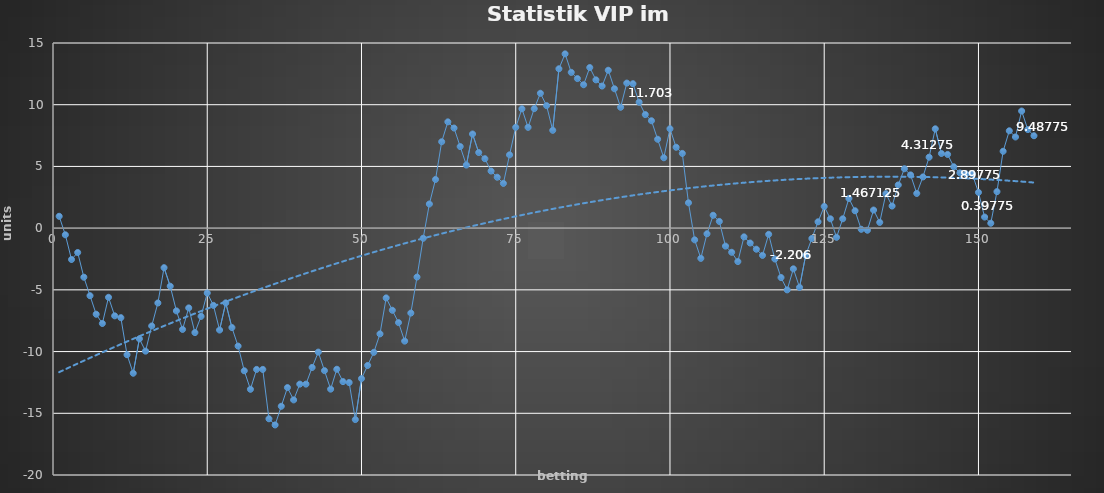
| Category | Series 0 |
|---|---|
| 0 | 0.96 |
| 1 | -0.54 |
| 2 | -2.54 |
| 3 | -1.974 |
| 4 | -3.974 |
| 5 | -5.474 |
| 6 | -6.974 |
| 7 | -7.724 |
| 8 | -5.604 |
| 9 | -7.104 |
| 10 | -7.254 |
| 11 | -10.254 |
| 12 | -11.754 |
| 13 | -8.965 |
| 14 | -9.965 |
| 15 | -7.925 |
| 16 | -6.065 |
| 17 | -3.204 |
| 18 | -4.704 |
| 19 | -6.704 |
| 20 | -8.204 |
| 21 | -6.461 |
| 22 | -8.461 |
| 23 | -7.147 |
| 24 | -5.255 |
| 25 | -6.255 |
| 26 | -8.255 |
| 27 | -6.055 |
| 28 | -8.055 |
| 29 | -9.555 |
| 30 | -11.555 |
| 31 | -13.055 |
| 32 | -11.445 |
| 33 | -11.445 |
| 34 | -15.445 |
| 35 | -15.945 |
| 36 | -14.43 |
| 37 | -12.915 |
| 38 | -13.915 |
| 39 | -12.636 |
| 40 | -12.636 |
| 41 | -11.286 |
| 42 | -10.043 |
| 43 | -11.543 |
| 44 | -13.043 |
| 45 | -11.433 |
| 46 | -12.433 |
| 47 | -12.508 |
| 48 | -15.508 |
| 49 | -12.188 |
| 50 | -11.123 |
| 51 | -10.058 |
| 52 | -8.566 |
| 53 | -5.652 |
| 54 | -6.652 |
| 55 | -7.652 |
| 56 | -9.152 |
| 57 | -6.879 |
| 58 | -3.962 |
| 59 | -0.82 |
| 60 | 1.955 |
| 61 | 3.945 |
| 62 | 6.999 |
| 63 | 8.612 |
| 64 | 8.112 |
| 65 | 6.612 |
| 66 | 5.112 |
| 67 | 7.627 |
| 68 | 6.127 |
| 69 | 5.627 |
| 70 | 4.627 |
| 71 | 4.127 |
| 72 | 3.627 |
| 73 | 5.939 |
| 74 | 8.169 |
| 75 | 9.669 |
| 76 | 8.169 |
| 77 | 9.684 |
| 78 | 10.927 |
| 79 | 9.927 |
| 80 | 7.927 |
| 81 | 12.912 |
| 82 | 14.119 |
| 83 | 12.619 |
| 84 | 12.119 |
| 85 | 11.619 |
| 86 | 13.014 |
| 87 | 12.014 |
| 88 | 11.514 |
| 89 | 12.793 |
| 90 | 11.293 |
| 91 | 9.793 |
| 92 | 11.753 |
| 93 | 11.703 |
| 94 | 10.203 |
| 95 | 9.203 |
| 96 | 8.703 |
| 97 | 7.203 |
| 98 | 5.703 |
| 99 | 8.054 |
| 100 | 6.554 |
| 101 | 6.054 |
| 102 | 2.054 |
| 103 | -0.946 |
| 104 | -2.446 |
| 105 | -0.456 |
| 106 | 1.044 |
| 107 | 0.544 |
| 108 | -1.456 |
| 109 | -1.956 |
| 110 | -2.706 |
| 111 | -0.706 |
| 112 | -1.206 |
| 113 | -1.706 |
| 114 | -2.206 |
| 115 | -0.501 |
| 116 | -2.501 |
| 117 | -4.001 |
| 118 | -5.001 |
| 119 | -3.296 |
| 120 | -4.796 |
| 121 | -2.196 |
| 122 | -0.836 |
| 123 | 0.514 |
| 124 | 1.757 |
| 125 | 0.757 |
| 126 | -0.743 |
| 127 | 0.757 |
| 128 | 2.407 |
| 129 | 1.407 |
| 130 | -0.093 |
| 131 | -0.168 |
| 132 | 1.467 |
| 133 | 0.467 |
| 134 | 2.792 |
| 135 | 1.792 |
| 136 | 3.498 |
| 137 | 4.813 |
| 138 | 4.313 |
| 139 | 2.813 |
| 140 | 4.148 |
| 141 | 5.748 |
| 142 | 8.048 |
| 143 | 6.048 |
| 144 | 5.973 |
| 145 | 4.973 |
| 146 | 4.473 |
| 147 | 4.398 |
| 148 | 4.398 |
| 149 | 2.898 |
| 150 | 0.898 |
| 151 | 0.398 |
| 152 | 2.958 |
| 153 | 6.228 |
| 154 | 7.888 |
| 155 | 7.388 |
| 156 | 9.488 |
| 157 | 7.988 |
| 158 | 7.488 |